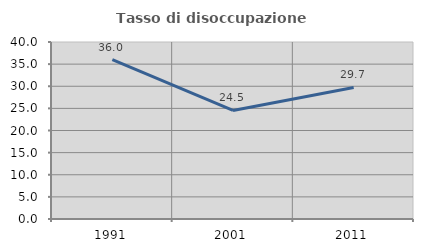
| Category | Tasso di disoccupazione giovanile  |
|---|---|
| 1991.0 | 36 |
| 2001.0 | 24.528 |
| 2011.0 | 29.73 |